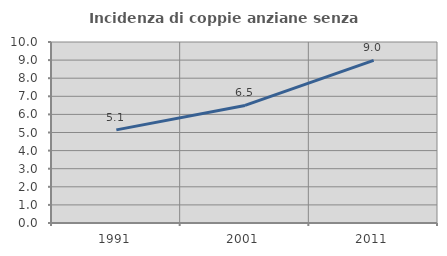
| Category | Incidenza di coppie anziane senza figli  |
|---|---|
| 1991.0 | 5.144 |
| 2001.0 | 6.494 |
| 2011.0 | 8.986 |